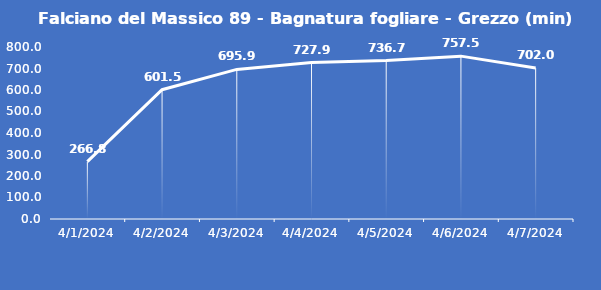
| Category | Falciano del Massico 89 - Bagnatura fogliare - Grezzo (min) |
|---|---|
| 4/1/24 | 266.8 |
| 4/2/24 | 601.5 |
| 4/3/24 | 695.9 |
| 4/4/24 | 727.9 |
| 4/5/24 | 736.7 |
| 4/6/24 | 757.5 |
| 4/7/24 | 702 |